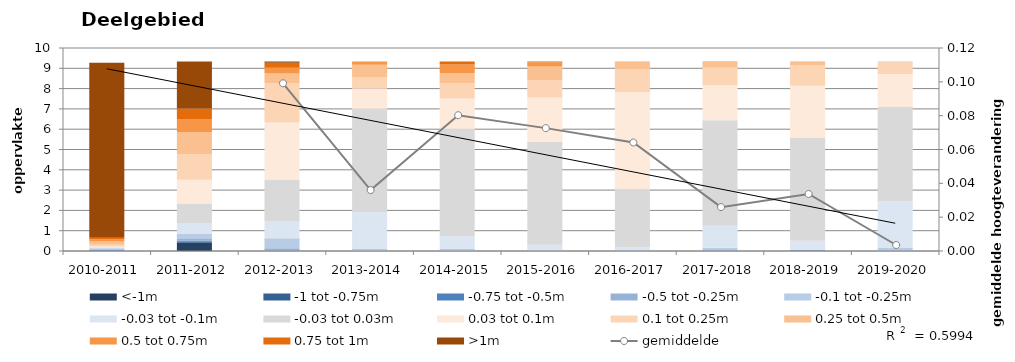
| Category | <-1m | -1 tot -0.75m | -0.75 tot -0.5m | -0.5 tot -0.25m | -0.1 tot -0.25m | -0.03 tot -0.1m | -0.03 tot 0.03m | 0.03 tot 0.1m | 0.1 tot 0.25m | 0.25 tot 0.5m | 0.5 tot 0.75m | 0.75 tot 1m | >1m |
|---|---|---|---|---|---|---|---|---|---|---|---|---|---|
| 2010-2011 | 0.005 | 0.009 | 0.026 | 0.042 | 0.05 | 0.028 | 0.026 | 0.035 | 0.087 | 0.162 | 0.105 | 0.081 | 8.612 |
| 2011-2012 | 0.403 | 0.057 | 0.054 | 0.079 | 0.241 | 0.54 | 0.961 | 1.177 | 1.24 | 1.115 | 0.633 | 0.52 | 2.318 |
| 2012-2013 | 0 | 0.003 | 0.01 | 0.126 | 0.488 | 0.856 | 2.044 | 2.8 | 1.942 | 0.473 | 0.286 | 0.241 | 0.068 |
| 2013-2014 | 0 | 0 | 0 | 0.008 | 0.113 | 1.803 | 5.088 | 0.992 | 0.541 | 0.626 | 0.159 | 0.006 | 0 |
| 2014-2015 | 0 | 0 | 0.001 | 0.004 | 0.091 | 0.632 | 5.299 | 1.483 | 0.749 | 0.508 | 0.415 | 0.144 | 0.01 |
| 2015-2016 | 0 | 0 | 0 | 0.003 | 0.032 | 0.276 | 5.059 | 2.193 | 0.86 | 0.668 | 0.212 | 0.034 | 0 |
| 2016-2017 | 0 | 0.001 | 0.001 | 0.006 | 0.031 | 0.146 | 2.874 | 4.766 | 1.116 | 0.376 | 0.018 | 0 | 0 |
| 2017-2018 | 0.001 | 0.002 | 0.013 | 0.025 | 0.12 | 1.08 | 5.205 | 1.718 | 0.88 | 0.269 | 0.022 | 0.001 | 0 |
| 2018-2019 | 0.017 | 0.006 | 0.007 | 0.017 | 0.026 | 0.426 | 5.09 | 2.552 | 1.022 | 0.158 | 0.015 | 0 | 0 |
| 2019-2020 | 0 | 0 | 0.001 | 0.011 | 0.133 | 2.292 | 4.659 | 1.618 | 0.572 | 0.044 | 0.007 | 0 | 0 |